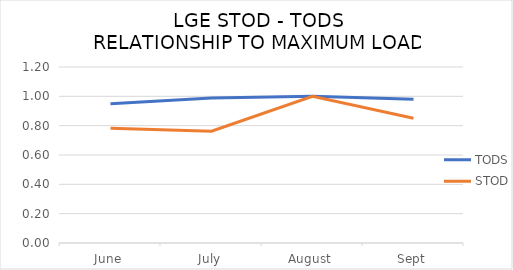
| Category | TODS | STOD |
|---|---|---|
| June | 0.95 | 0.783 |
| July | 0.989 | 0.762 |
| August | 1 | 1 |
| Sept | 0.98 | 0.85 |